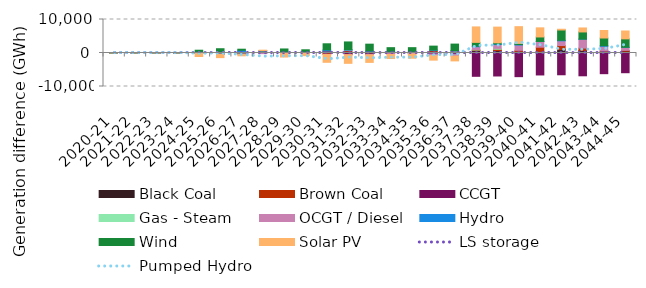
| Category | Black Coal | Brown Coal | CCGT | Gas - Steam | OCGT / Diesel | Hydro | Wind | Solar PV |
|---|---|---|---|---|---|---|---|---|
| 2020-21 | 0.058 | 0.017 | 0.003 | 0.001 | 0.004 | 0 | 0.016 | -0.001 |
| 2021-22 | 0.098 | 0.028 | 0.003 | 0 | 0.005 | 0.002 | 0.026 | 0.005 |
| 2022-23 | 0.078 | 0.137 | 0.004 | 0 | 0.004 | -0.011 | -0.005 | 0 |
| 2023-24 | -0.374 | 0.111 | 0.282 | 0.089 | 0.042 | -0.98 | 1.961 | 0.004 |
| 2024-25 | 63.92 | -51.053 | 91.746 | 6.098 | 14.929 | -8.334 | 653.975 | -994.265 |
| 2025-26 | -305.638 | 287.984 | -28.821 | -29.733 | -24.935 | -16.593 | 986.903 | -974.841 |
| 2026-27 | -332.94 | 287.184 | 46.497 | -15.754 | -88.155 | 488.595 | 308.037 | -402.401 |
| 2027-28 | 187.714 | -114.031 | 44.899 | -11.64 | -59.956 | 361.56 | 80.47 | 161.748 |
| 2028-29 | 12.053 | 6.729 | 60.035 | 7.717 | -58.585 | 184.604 | 933.87 | -1147.716 |
| 2029-30 | 88.758 | -60.057 | 15.76 | 12.004 | -33.797 | 198.092 | 645.347 | -699.992 |
| 2030-31 | 498.138 | -416.754 | 158.857 | 18.436 | -45.272 | 263.819 | 1811.501 | -2316.651 |
| 2031-32 | -250.81 | 848.713 | -251.305 | 18.767 | -6.2 | 183.436 | 2250.142 | -2579.337 |
| 2032-33 | -359.381 | 375.695 | -36.857 | 39.892 | -158.102 | 148.298 | 2072.263 | -2249.513 |
| 2033-34 | 72.027 | 142.539 | -213.934 | 10.015 | -161.361 | 236.33 | 1129.983 | -1278.286 |
| 2034-35 | 11.483 | 136.284 | -149.758 | -10.555 | -87.85 | 169.606 | 1275.607 | -1308.437 |
| 2035-36 | 229.449 | 508.566 | -282.949 | 41.789 | -436.826 | 98.591 | 1174.306 | -1407.948 |
| 2036-37 | 269.453 | 300.021 | -365.614 | 55.646 | -545.301 | 83.316 | 1949.82 | -1446.463 |
| 2037-38 | 700.19 | 183.94 | -6958.645 | 165.253 | 824.942 | 154.131 | 1142.047 | 4615.314 |
| 2038-39 | 703.988 | 400.451 | -6859.534 | 278.809 | 1159.721 | 145.086 | 366.825 | 4673.311 |
| 2039-40 | 380.789 | 422.238 | -7059.449 | 0 | 1559.691 | 161.063 | 337.174 | 5003.003 |
| 2040-41 | 373.468 | 1355.2 | -6554.217 | 0 | 1714.935 | 12.809 | 1331.997 | 2719.573 |
| 2041-42 | 1018.438 | 1202.291 | -6495.979 | 0 | 1403.079 | 164.552 | 3075.688 | 229.801 |
| 2042-43 | 704.493 | 762.407 | -6803.013 | 0 | 2650.43 | 18.209 | 2148.062 | 1193.433 |
| 2043-44 | 543.348 | 66.666 | -6171.896 | 0 | 1387.893 | 168.366 | 2306.734 | 2252.344 |
| 2044-45 | 523.205 | 264.877 | -5885.176 | 0 | 870.152 | 51.078 | 2509.412 | 2349.451 |